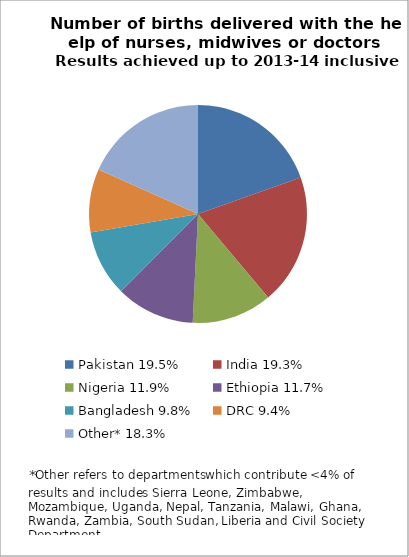
| Category | Series 0 |
|---|---|
| Pakistan 19.5% | 19.546 |
| India 19.3% | 19.329 |
| Nigeria 11.9% | 11.9 |
| Ethiopia 11.7% | 11.691 |
| Bangladesh 9.8% | 9.823 |
| DRC 9.4% | 9.412 |
| Other* 18.3% | 18.299 |